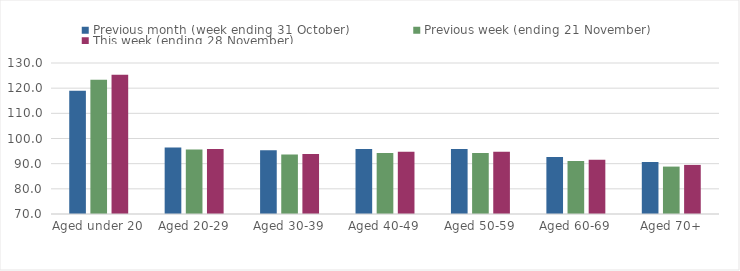
| Category | Previous month (week ending 31 October) | Previous week (ending 21 November) | This week (ending 28 November) |
|---|---|---|---|
| Aged under 20 | 118.94 | 123.39 | 125.3 |
| Aged 20-29 | 96.39 | 95.61 | 95.82 |
| Aged 30-39 | 95.36 | 93.65 | 93.89 |
| Aged 40-49 | 95.87 | 94.27 | 94.69 |
| Aged 50-59 | 95.78 | 94.23 | 94.78 |
| Aged 60-69 | 92.6 | 91.03 | 91.54 |
| Aged 70+ | 90.63 | 88.84 | 89.51 |